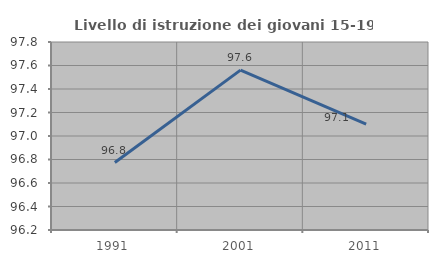
| Category | Livello di istruzione dei giovani 15-19 anni |
|---|---|
| 1991.0 | 96.774 |
| 2001.0 | 97.561 |
| 2011.0 | 97.101 |